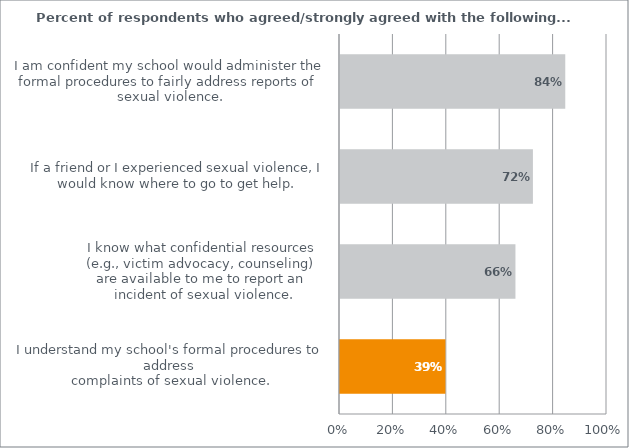
| Category | Percent |
|---|---|
| I understand my school's formal procedures to address 
complaints of sexual violence. | 0.395 |
| I know what confidential resources 
(e.g., victim advocacy, counseling) 
are available to me to report an 
incident of sexual violence. | 0.657 |
| If a friend or I experienced sexual violence, I would know where to go to get help. | 0.723 |
| I am confident my school would administer the formal procedures to fairly address reports of sexual violence. | 0.844 |